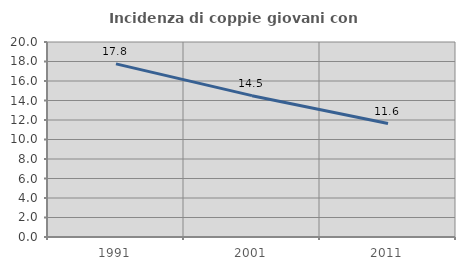
| Category | Incidenza di coppie giovani con figli |
|---|---|
| 1991.0 | 17.757 |
| 2001.0 | 14.496 |
| 2011.0 | 11.636 |